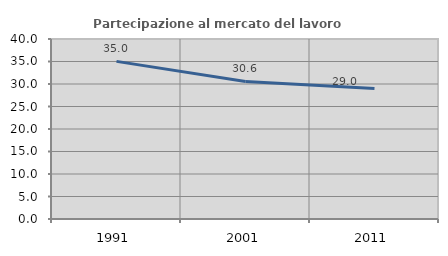
| Category | Partecipazione al mercato del lavoro  femminile |
|---|---|
| 1991.0 | 35.025 |
| 2001.0 | 30.567 |
| 2011.0 | 29.024 |